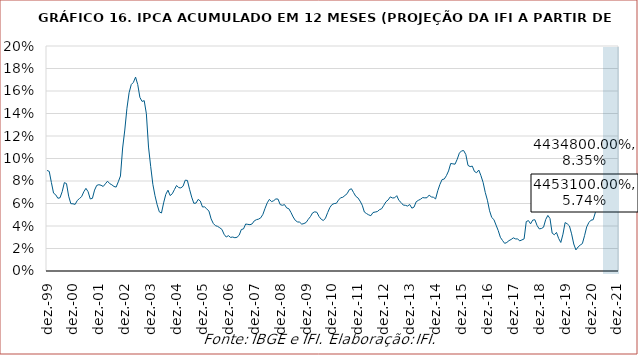
| Category | Series 0 |
|---|---|
| 1999-12-01 | 0.089 |
| 2000-01-01 | 0.089 |
| 2000-02-01 | 0.079 |
| 2000-03-01 | 0.069 |
| 2000-04-01 | 0.068 |
| 2000-05-01 | 0.065 |
| 2000-06-01 | 0.065 |
| 2000-07-01 | 0.071 |
| 2000-08-01 | 0.079 |
| 2000-09-01 | 0.078 |
| 2000-10-01 | 0.067 |
| 2000-11-01 | 0.06 |
| 2000-12-01 | 0.06 |
| 2001-01-01 | 0.059 |
| 2001-02-01 | 0.063 |
| 2001-03-01 | 0.064 |
| 2001-04-01 | 0.066 |
| 2001-05-01 | 0.07 |
| 2001-06-01 | 0.073 |
| 2001-07-01 | 0.071 |
| 2001-08-01 | 0.064 |
| 2001-09-01 | 0.065 |
| 2001-10-01 | 0.072 |
| 2001-11-01 | 0.076 |
| 2001-12-01 | 0.077 |
| 2002-01-01 | 0.076 |
| 2002-02-01 | 0.075 |
| 2002-03-01 | 0.077 |
| 2002-04-01 | 0.08 |
| 2002-05-01 | 0.078 |
| 2002-06-01 | 0.077 |
| 2002-07-01 | 0.075 |
| 2002-08-01 | 0.075 |
| 2002-09-01 | 0.079 |
| 2002-10-01 | 0.084 |
| 2002-11-01 | 0.109 |
| 2002-12-01 | 0.125 |
| 2003-01-01 | 0.145 |
| 2003-02-01 | 0.158 |
| 2003-03-01 | 0.166 |
| 2003-04-01 | 0.168 |
| 2003-05-01 | 0.172 |
| 2003-06-01 | 0.166 |
| 2003-07-01 | 0.154 |
| 2003-08-01 | 0.151 |
| 2003-09-01 | 0.151 |
| 2003-10-01 | 0.14 |
| 2003-11-01 | 0.11 |
| 2003-12-01 | 0.093 |
| 2004-01-01 | 0.077 |
| 2004-02-01 | 0.067 |
| 2004-03-01 | 0.059 |
| 2004-04-01 | 0.053 |
| 2004-05-01 | 0.052 |
| 2004-06-01 | 0.061 |
| 2004-07-01 | 0.068 |
| 2004-08-01 | 0.072 |
| 2004-09-01 | 0.067 |
| 2004-10-01 | 0.069 |
| 2004-11-01 | 0.072 |
| 2004-12-01 | 0.076 |
| 2005-01-01 | 0.074 |
| 2005-02-01 | 0.074 |
| 2005-03-01 | 0.075 |
| 2005-04-01 | 0.081 |
| 2005-05-01 | 0.081 |
| 2005-06-01 | 0.073 |
| 2005-07-01 | 0.066 |
| 2005-08-01 | 0.06 |
| 2005-09-01 | 0.06 |
| 2005-10-01 | 0.064 |
| 2005-11-01 | 0.062 |
| 2005-12-01 | 0.057 |
| 2006-01-01 | 0.057 |
| 2006-02-01 | 0.055 |
| 2006-03-01 | 0.053 |
| 2006-04-01 | 0.046 |
| 2006-05-01 | 0.042 |
| 2006-06-01 | 0.04 |
| 2006-07-01 | 0.04 |
| 2006-08-01 | 0.038 |
| 2006-09-01 | 0.037 |
| 2006-10-01 | 0.033 |
| 2006-11-01 | 0.03 |
| 2006-12-01 | 0.031 |
| 2007-01-01 | 0.03 |
| 2007-02-01 | 0.03 |
| 2007-03-01 | 0.03 |
| 2007-04-01 | 0.03 |
| 2007-05-01 | 0.032 |
| 2007-06-01 | 0.037 |
| 2007-07-01 | 0.037 |
| 2007-08-01 | 0.042 |
| 2007-09-01 | 0.041 |
| 2007-10-01 | 0.041 |
| 2007-11-01 | 0.042 |
| 2007-12-01 | 0.045 |
| 2008-01-01 | 0.046 |
| 2008-02-01 | 0.046 |
| 2008-03-01 | 0.047 |
| 2008-04-01 | 0.05 |
| 2008-05-01 | 0.056 |
| 2008-06-01 | 0.061 |
| 2008-07-01 | 0.064 |
| 2008-08-01 | 0.062 |
| 2008-09-01 | 0.063 |
| 2008-10-01 | 0.064 |
| 2008-11-01 | 0.064 |
| 2008-12-01 | 0.059 |
| 2009-01-01 | 0.058 |
| 2009-02-01 | 0.059 |
| 2009-03-01 | 0.056 |
| 2009-04-01 | 0.055 |
| 2009-05-01 | 0.052 |
| 2009-06-01 | 0.048 |
| 2009-07-01 | 0.045 |
| 2009-08-01 | 0.044 |
| 2009-09-01 | 0.043 |
| 2009-10-01 | 0.042 |
| 2009-11-01 | 0.042 |
| 2009-12-01 | 0.043 |
| 2010-01-01 | 0.046 |
| 2010-02-01 | 0.048 |
| 2010-03-01 | 0.052 |
| 2010-04-01 | 0.053 |
| 2010-05-01 | 0.052 |
| 2010-06-01 | 0.048 |
| 2010-07-01 | 0.046 |
| 2010-08-01 | 0.045 |
| 2010-09-01 | 0.047 |
| 2010-10-01 | 0.052 |
| 2010-11-01 | 0.056 |
| 2010-12-01 | 0.059 |
| 2011-01-01 | 0.06 |
| 2011-02-01 | 0.06 |
| 2011-03-01 | 0.063 |
| 2011-04-01 | 0.065 |
| 2011-05-01 | 0.066 |
| 2011-06-01 | 0.067 |
| 2011-07-01 | 0.069 |
| 2011-08-01 | 0.072 |
| 2011-09-01 | 0.073 |
| 2011-10-01 | 0.07 |
| 2011-11-01 | 0.066 |
| 2011-12-01 | 0.065 |
| 2012-01-01 | 0.062 |
| 2012-02-01 | 0.058 |
| 2012-03-01 | 0.052 |
| 2012-04-01 | 0.051 |
| 2012-05-01 | 0.05 |
| 2012-06-01 | 0.049 |
| 2012-07-01 | 0.052 |
| 2012-08-01 | 0.052 |
| 2012-09-01 | 0.053 |
| 2012-10-01 | 0.055 |
| 2012-11-01 | 0.055 |
| 2012-12-01 | 0.058 |
| 2013-01-01 | 0.062 |
| 2013-02-01 | 0.063 |
| 2013-03-01 | 0.066 |
| 2013-04-01 | 0.065 |
| 2013-05-01 | 0.065 |
| 2013-06-01 | 0.067 |
| 2013-07-01 | 0.063 |
| 2013-08-01 | 0.061 |
| 2013-09-01 | 0.059 |
| 2013-10-01 | 0.058 |
| 2013-11-01 | 0.058 |
| 2013-12-01 | 0.059 |
| 2014-01-01 | 0.056 |
| 2014-02-01 | 0.057 |
| 2014-03-01 | 0.062 |
| 2014-04-01 | 0.063 |
| 2014-05-01 | 0.064 |
| 2014-06-01 | 0.065 |
| 2014-07-01 | 0.065 |
| 2014-08-01 | 0.065 |
| 2014-09-01 | 0.067 |
| 2014-10-01 | 0.066 |
| 2014-11-01 | 0.066 |
| 2014-12-01 | 0.064 |
| 2015-01-01 | 0.071 |
| 2015-02-01 | 0.077 |
| 2015-03-01 | 0.081 |
| 2015-04-01 | 0.082 |
| 2015-05-01 | 0.085 |
| 2015-06-01 | 0.089 |
| 2015-07-01 | 0.096 |
| 2015-08-01 | 0.095 |
| 2015-09-01 | 0.095 |
| 2015-10-01 | 0.099 |
| 2015-11-01 | 0.105 |
| 2015-12-01 | 0.107 |
| 2016-01-01 | 0.107 |
| 2016-02-01 | 0.104 |
| 2016-03-01 | 0.094 |
| 2016-04-01 | 0.093 |
| 2016-05-01 | 0.093 |
| 2016-06-01 | 0.088 |
| 2016-07-01 | 0.087 |
| 2016-08-01 | 0.09 |
| 2016-09-01 | 0.085 |
| 2016-10-01 | 0.079 |
| 2016-11-01 | 0.07 |
| 2016-12-01 | 0.063 |
| 2017-01-01 | 0.054 |
| 2017-02-01 | 0.048 |
| 2017-03-01 | 0.046 |
| 2017-04-01 | 0.041 |
| 2017-05-01 | 0.036 |
| 2017-06-01 | 0.03 |
| 2017-07-01 | 0.027 |
| 2017-08-01 | 0.025 |
| 2017-09-01 | 0.025 |
| 2017-10-01 | 0.027 |
| 2017-11-01 | 0.028 |
| 2017-12-01 | 0.029 |
| 2018-01-01 | 0.029 |
| 2018-02-01 | 0.028 |
| 2018-03-01 | 0.027 |
| 2018-04-01 | 0.028 |
| 2018-05-01 | 0.029 |
| 2018-06-01 | 0.044 |
| 2018-07-01 | 0.045 |
| 2018-08-01 | 0.042 |
| 2018-09-01 | 0.045 |
| 2018-10-01 | 0.046 |
| 2018-11-01 | 0.04 |
| 2018-12-01 | 0.037 |
| 2019-01-01 | 0.038 |
| 2019-02-01 | 0.039 |
| 2019-03-01 | 0.046 |
| 2019-04-01 | 0.049 |
| 2019-05-01 | 0.047 |
| 2019-06-01 | 0.034 |
| 2019-07-01 | 0.032 |
| 2019-08-01 | 0.034 |
| 2019-09-01 | 0.029 |
| 2019-10-01 | 0.025 |
| 2019-11-01 | 0.033 |
| 2019-12-01 | 0.043 |
| 2020-01-01 | 0.042 |
| 2020-02-01 | 0.04 |
| 2020-03-01 | 0.033 |
| 2020-04-01 | 0.024 |
| 2020-05-01 | 0.019 |
| 2020-06-01 | 0.021 |
| 2020-07-01 | 0.023 |
| 2020-08-01 | 0.024 |
| 2020-09-01 | 0.031 |
| 2020-10-01 | 0.039 |
| 2020-11-01 | 0.043 |
| 2020-12-01 | 0.045 |
| 2021-01-01 | 0.046 |
| 2021-02-01 | 0.052 |
| 2021-03-01 | 0.061 |
| 2021-04-01 | 0.068 |
| 2021-05-01 | 0.081 |
| 2021-06-01 | 0.084 |
| 2021-07-01 | 0.083 |
| 2021-08-01 | 0.083 |
| 2021-09-01 | 0.079 |
| 2021-10-01 | 0.074 |
| 2021-11-01 | 0.068 |
| 2021-12-01 | 0.057 |